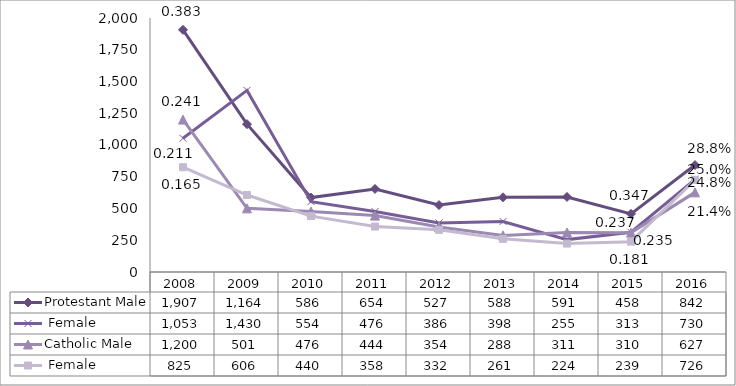
| Category | Protestant | Catholic |
|---|---|---|
| 2008.0 | 1053 | 825 |
| 2009.0 | 1430 | 606 |
| 2010.0 | 554 | 440 |
| 2011.0 | 476 | 358 |
| 2012.0 | 386 | 332 |
| 2013.0 | 398 | 261 |
| 2014.0 | 255 | 224 |
| 2015.0 | 313 | 239 |
| 2016.0 | 730 | 726 |